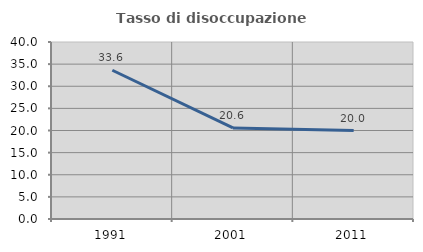
| Category | Tasso di disoccupazione giovanile  |
|---|---|
| 1991.0 | 33.621 |
| 2001.0 | 20.588 |
| 2011.0 | 20 |